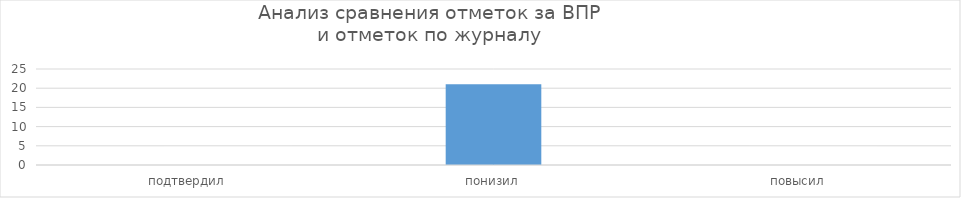
| Category | Series 0 |
|---|---|
| подтвердил | 0 |
| понизил | 21 |
| повысил | 0 |